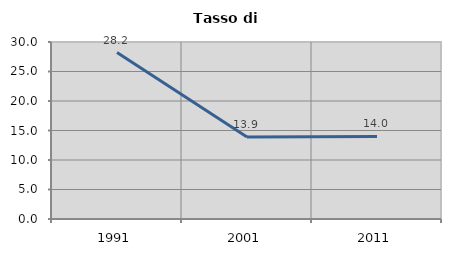
| Category | Tasso di disoccupazione   |
|---|---|
| 1991.0 | 28.211 |
| 2001.0 | 13.915 |
| 2011.0 | 13.987 |